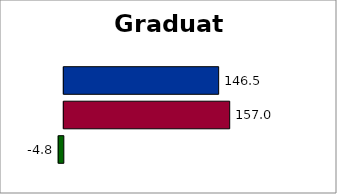
| Category | Series 2 | SREB states | 50 states and D.C. |
|---|---|---|---|
| 0 | -4.847 | 156.986 | 146.534 |